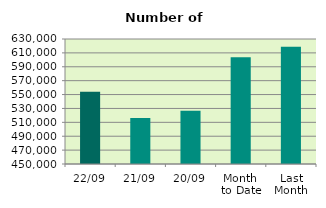
| Category | Series 0 |
|---|---|
| 22/09 | 554052 |
| 21/09 | 516332 |
| 20/09 | 526618 |
| Month 
to Date | 603815 |
| Last
Month | 618945.565 |